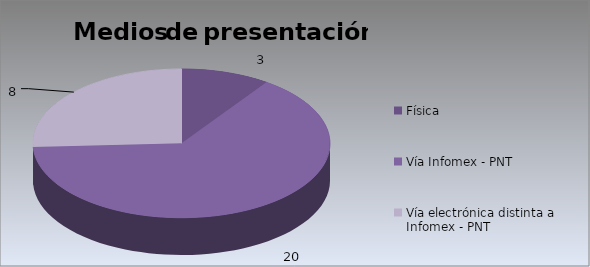
| Category | Series 0 |
|---|---|
| Física | 3 |
| Vía Infomex - PNT | 20 |
| Vía electrónica distinta a Infomex - PNT | 8 |